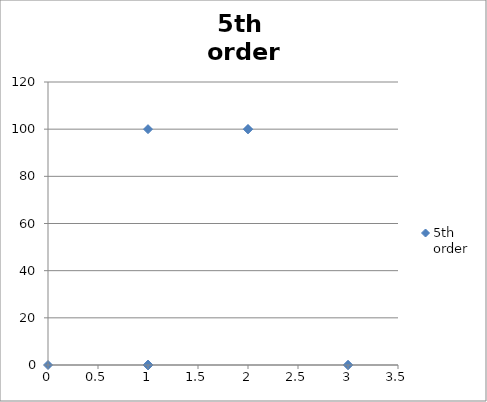
| Category | 5th 
order |
|---|---|
| 3.0 | 0 |
| 1.0 | 100 |
| 0.0 | 0 |
| 1.0 | 0 |
| 2.0 | 100 |
| 3.0 | 0 |
| 1.0 | 0 |
| 1.0 | 0 |
| 2.0 | 100 |
| 1.0 | 0 |